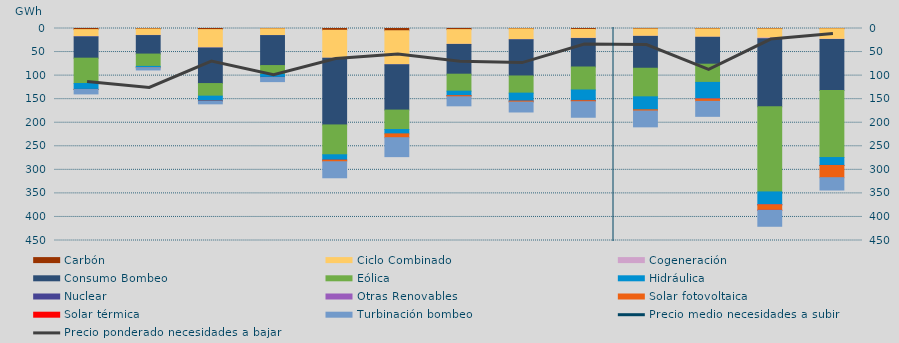
| Category | Carbón | Ciclo Combinado | Cogeneración | Consumo Bombeo | Eólica | Hidráulica | Nuclear | Otras Renovables | Solar fotovoltaica | Solar térmica | Turbinación bombeo |
|---|---|---|---|---|---|---|---|---|---|---|---|
| 0 | 2349.7 | 14809.8 | 513.2 | 45318.9 | 53811.9 | 12435.2 | 162.7 | 0 | 147 | 0 | 9302.2 |
| 1 | 1032.05 | 13586.525 | 372.15 | 39287.3 | 26177.05 | 2674.925 | 0 | 0 | 91.5 | 0 | 4779.4 |
| 2 | 2338.05 | 38734.9 | 425.275 | 75366.15 | 26713.775 | 10087.325 | 758.925 | 0 | 314.05 | 0 | 5208.05 |
| 3 | 607 | 14346.825 | 84.1 | 63631.75 | 18608.375 | 6324.8 | 376.5 | 0.25 | 124.625 | 0 | 8670.125 |
| 4 | 3747 | 59427.025 | 92.6 | 141431.55 | 63317 | 11208.6 | 225.6 | 0 | 3390.725 | 0 | 34005.35 |
| 5 | 4777.9 | 72027.575 | 369 | 96009.825 | 41297.175 | 9161.725 | 0 | 0 | 8173.5 | 0 | 40164.95 |
| 6 | 2339.95 | 31212.45 | 309 | 63146.125 | 35992.6 | 9536.075 | 20 | 0 | 2519.6 | 0 | 19037.975 |
| 7 | 804 | 22741.325 | 259.55 | 76959.4 | 36430.1 | 16893 | 82 | 0 | 2101.325 | 0 | 20947.55 |
| 8 | 1954 | 18792.9 | 569.425 | 60395.65 | 48803.7 | 22168.6 | 540.725 | 0 | 2191.975 | 0 | 32969.35 |
| 9 | 1013 | 15498.975 | 284.05 | 67580.25 | 60658.55 | 27501.4 | 0 | 0 | 2682.825 | 0 | 33526.625 |
| 10 | 883 | 17650.875 | 181.5 | 57086.475 | 38624.325 | 35109.7 | 186 | 16 | 4912.925 | 0 | 31800.3 |
| 11 | 906 | 19278.9 | 1400.95 | 144482.175 | 180813.55 | 26734.575 | 692.75 | 22 | 11477.9 | 11 | 34001.625 |
| 12 | 552 | 22218.15 | 797.8 | 108258.5 | 142089.65 | 16666.15 | 246.5 | 0 | 25852.05 | 0 | 26149.6 |